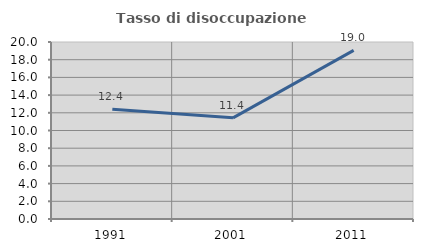
| Category | Tasso di disoccupazione giovanile  |
|---|---|
| 1991.0 | 12.393 |
| 2001.0 | 11.429 |
| 2011.0 | 19.048 |